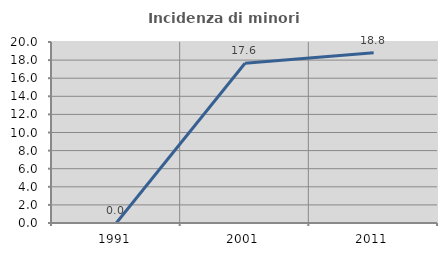
| Category | Incidenza di minori stranieri |
|---|---|
| 1991.0 | 0 |
| 2001.0 | 17.647 |
| 2011.0 | 18.8 |